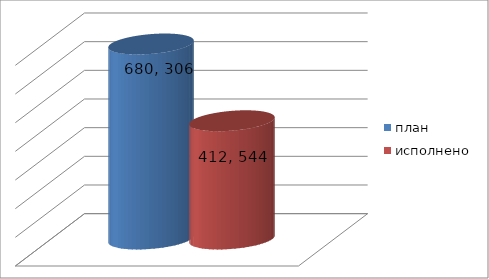
| Category | план | исполнено |
|---|---|---|
| 0 | 680306337 | 412544726.95 |